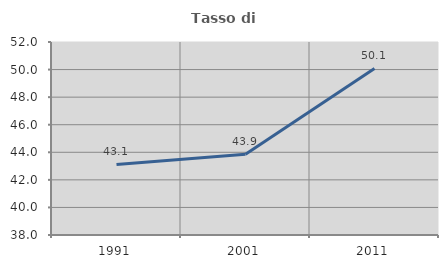
| Category | Tasso di occupazione   |
|---|---|
| 1991.0 | 43.117 |
| 2001.0 | 43.866 |
| 2011.0 | 50.086 |